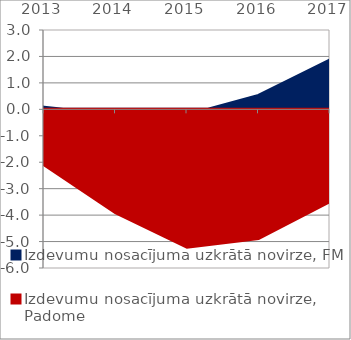
| Category | Izdevumu nosacījuma uzkrātā novirze, FM | Izdevumu nosacījuma uzkrātā novirze, Padome |
|---|---|---|
| 2013.0 | 0.081 | -2.099 |
| 2014.0 | -0.204 | -3.908 |
| 2015.0 | -0.216 | -5.213 |
| 2016.0 | 0.53 | -4.886 |
| 2017.0 | 1.867 | -3.49 |